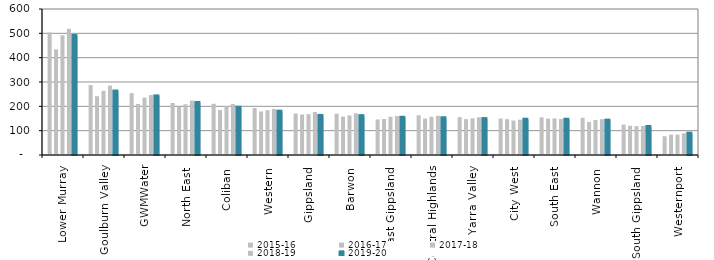
| Category | 2015-16 | 2016-17 | 2017-18 | 2018-19 | 2019-20 |
|---|---|---|---|---|---|
| Lower Murray  | 503.723 | 434.251 | 492.264 | 518.556 | 488.975 |
| Goulburn Valley  | 287.397 | 241.727 | 263.621 | 285.157 | 260.849 |
| GWMWater | 254.253 | 209.595 | 235.605 | 246.447 | 240.722 |
| North East  | 213.593 | 198.068 | 208.376 | 223.79 | 213.783 |
| Coliban  | 210.454 | 185.046 | 200.395 | 209.742 | 194.247 |
| Western  | 193.158 | 179.032 | 184.142 | 189.161 | 178.07 |
| Gippsland  | 170.425 | 166.069 | 167.811 | 176.608 | 160.564 |
| Barwon  | 169.866 | 157.541 | 162.684 | 171.116 | 159.665 |
| East Gippsland  | 146.107 | 147.773 | 157.422 | 159.875 | 152.937 |
| Central Highlands  | 163.346 | 149.6 | 156.994 | 161.029 | 150.933 |
| Yarra Valley  | 155.665 | 147.576 | 150.6 | 154.766 | 147.573 |
| City West  | 149.779 | 147.219 | 141.673 | 145.29 | 144.958 |
| South East  | 154.476 | 149.57 | 150.292 | 147.937 | 144.78 |
| Wannon  | 152.935 | 135.972 | 144.069 | 147.21 | 141.166 |
| South Gippsland  | 124.715 | 120.192 | 118.465 | 119.476 | 115.019 |
| Westernport  | 77.165 | 83.727 | 83.629 | 89.309 | 87.451 |